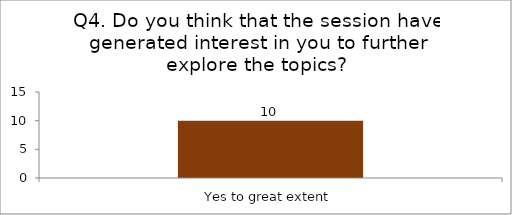
| Category | Q4. Do you think that the session have generated interest in you to further explore the topics? |
|---|---|
| Yes to great extent | 10 |